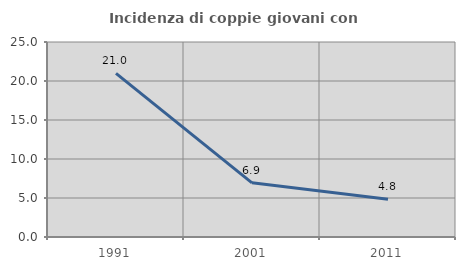
| Category | Incidenza di coppie giovani con figli |
|---|---|
| 1991.0 | 20.988 |
| 2001.0 | 6.944 |
| 2011.0 | 4.839 |